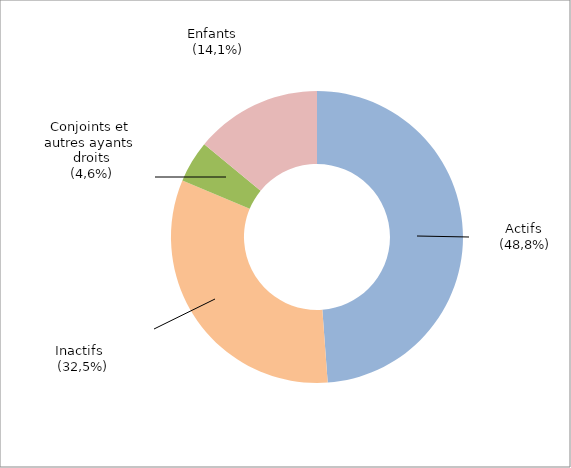
| Category | Series 0 |
|---|---|
| Actifs | 1527191 |
| Inactifs | 1016158 |
| Conjoints et autres ayants droit | 144708 |
| Enfants | 439239 |